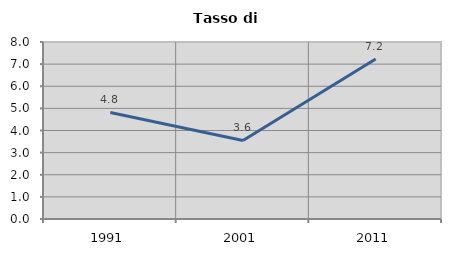
| Category | Tasso di disoccupazione   |
|---|---|
| 1991.0 | 4.817 |
| 2001.0 | 3.552 |
| 2011.0 | 7.231 |